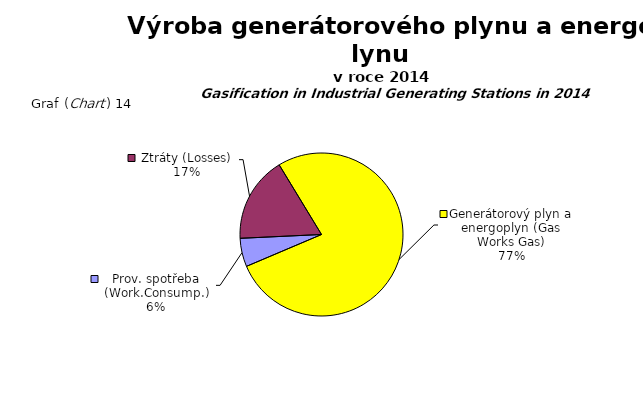
| Category | Series 0 |
|---|---|
| Prov. spotřeba (Work.Consump.) | 179151.4 |
| Ztráty (Losses) | 541927 |
| Generátorový plyn a energoplyn (Gas Works Gas) | 2455537 |